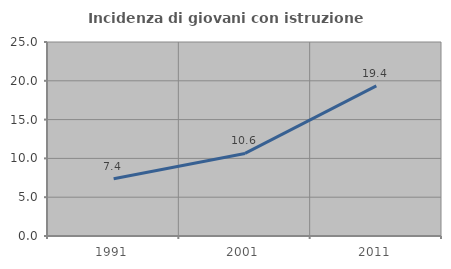
| Category | Incidenza di giovani con istruzione universitaria |
|---|---|
| 1991.0 | 7.368 |
| 2001.0 | 10.638 |
| 2011.0 | 19.355 |